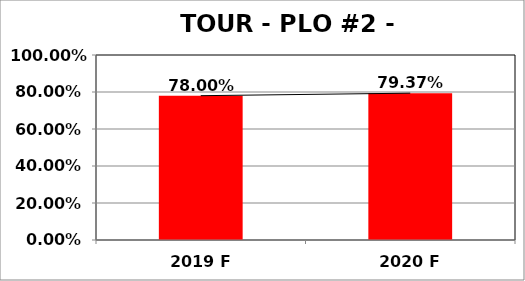
| Category | Series 0 |
|---|---|
| 2019 F | 0.78 |
| 2020 F | 0.794 |